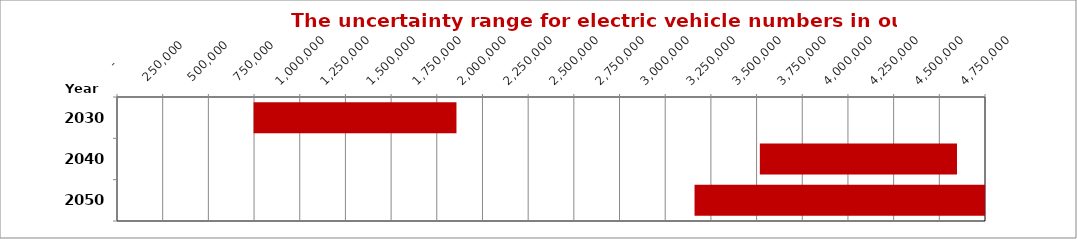
| Category | Min | Inc |
|---|---|---|
| 2030.0 | 747498 | 1110128 |
| 2040.0 | 3517771 | 1078971 |
| 2050.0 | 3160520 | 1860623 |